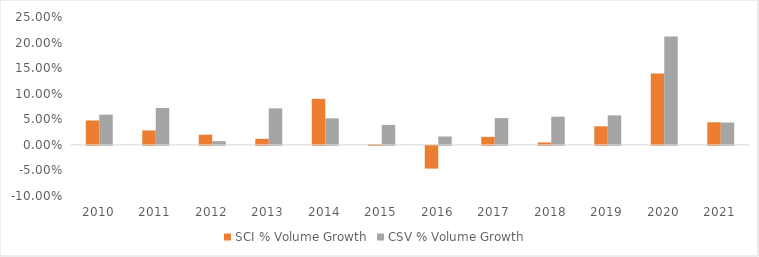
| Category | SCI % Volume Growth | CSV % Volume Growth |
|---|---|---|
| 2010.0 | 0.048 | 0.059 |
| 2011.0 | 0.028 | 0.072 |
| 2012.0 | 0.02 | 0.007 |
| 2013.0 | 0.012 | 0.071 |
| 2014.0 | 0.09 | 0.052 |
| 2015.0 | 0.001 | 0.039 |
| 2016.0 | -0.044 | 0.016 |
| 2017.0 | 0.016 | 0.052 |
| 2018.0 | 0.005 | 0.055 |
| 2019.0 | 0.036 | 0.058 |
| 2020.0 | 0.14 | 0.212 |
| 2021.0 | 0.044 | 0.044 |